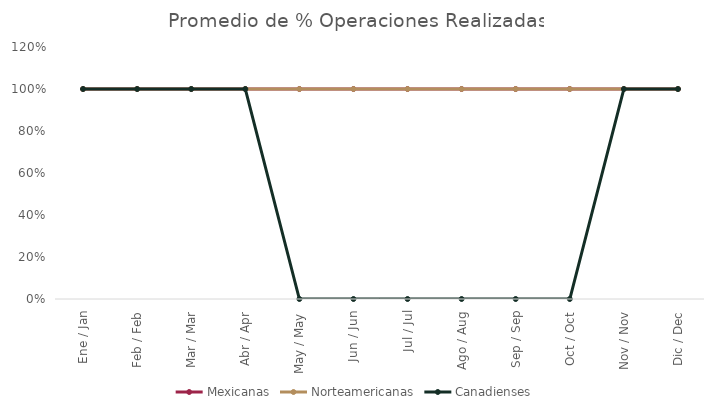
| Category | Mexicanas | Norteamericanas | Canadienses |
|---|---|---|---|
| Ene / Jan | 1 | 1 | 1 |
| Feb / Feb | 1 | 1 | 1 |
| Mar / Mar | 1 | 1 | 1 |
| Abr / Apr | 1 | 1 | 1 |
| May / May | 1 | 1 | 0 |
| Jun / Jun | 1 | 1 | 0 |
| Jul / Jul | 1 | 1 | 0 |
| Ago / Aug | 1 | 1 | 0 |
| Sep / Sep | 1 | 1 | 0 |
| Oct / Oct | 1 | 1 | 0 |
| Nov / Nov | 1 | 1 | 1 |
| Dic / Dec | 1 | 1 | 1 |